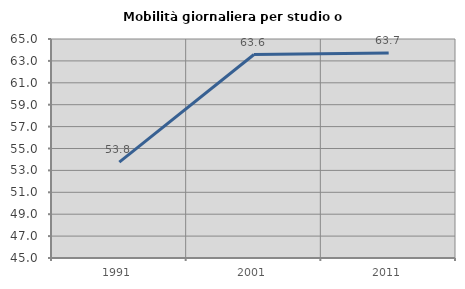
| Category | Mobilità giornaliera per studio o lavoro |
|---|---|
| 1991.0 | 53.762 |
| 2001.0 | 63.582 |
| 2011.0 | 63.729 |